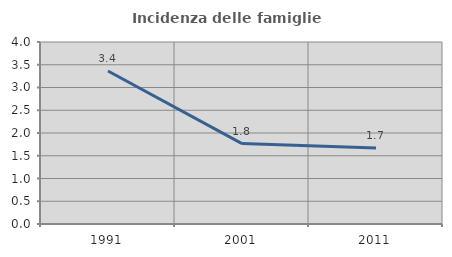
| Category | Incidenza delle famiglie numerose |
|---|---|
| 1991.0 | 3.364 |
| 2001.0 | 1.767 |
| 2011.0 | 1.668 |